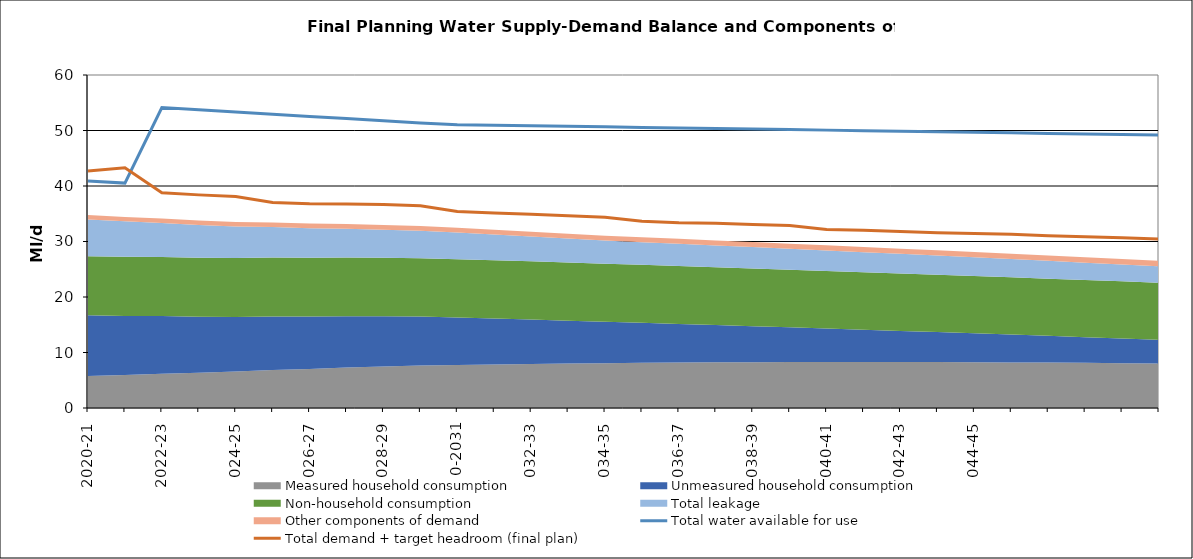
| Category | Total water available for use | Total demand + target headroom (final plan) |
|---|---|---|
| 2020-21 | 40.916 | 42.685 |
| 2021-22 | 40.521 | 43.27 |
| 2022-23 | 54.125 | 38.771 |
| 2023-24 | 53.729 | 38.401 |
| 2024-25 | 53.333 | 38.094 |
| 2025-26 | 52.937 | 37.029 |
| 2026-27 | 52.541 | 36.802 |
| 2027-28 | 52.146 | 36.777 |
| 2028-29 | 51.75 | 36.646 |
| 2029-30 | 51.354 | 36.451 |
| 2030-31 | 51.057 | 35.412 |
| 2031-32 | 50.958 | 35.141 |
| 2032-33 | 50.859 | 34.894 |
| 2033-34 | 50.76 | 34.65 |
| 2034-35 | 50.661 | 34.361 |
| 2035-36 | 50.562 | 33.649 |
| 2036-37 | 50.463 | 33.394 |
| 2037-38 | 50.364 | 33.294 |
| 2038-39 | 50.265 | 33.059 |
| 2039-40 | 50.166 | 32.867 |
| 2040-41 | 50.068 | 32.175 |
| 2041-42 | 49.969 | 32.019 |
| 2042-43 | 49.87 | 31.82 |
| 2043-44 | 49.771 | 31.585 |
| 2044-45 | 49.672 | 31.433 |
| 2045-46 | 49.573 | 31.299 |
| 2046-47 | 49.474 | 31.022 |
| 2047-48 | 49.375 | 30.858 |
| 2048-49 | 49.276 | 30.656 |
| 2049-50 | 49.177 | 30.446 |